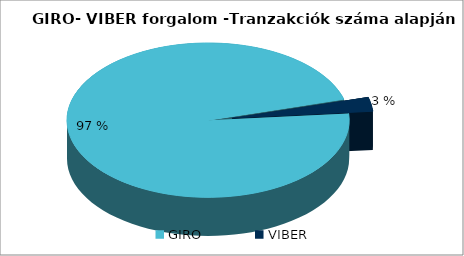
| Category | Series 0 |
|---|---|
| GIRO | 0.97 |
| VIBER | 0.03 |